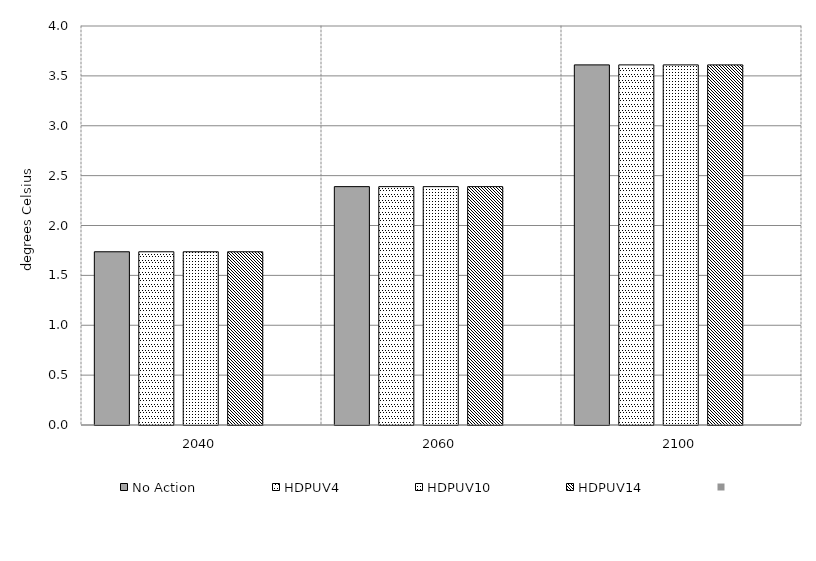
| Category | No Action | HDPUV4 | HDPUV10 | HDPUV14 | Series 4 | Alt 5 | Alt 6 | Alt 7 | Alt 8 | Alt 10 |
|---|---|---|---|---|---|---|---|---|---|---|
| 2040.0 | 1.737 | 1.737 | 1.737 | 1.737 |  |  |  |  |  |  |
| 2060.0 | 2.39 | 2.39 | 2.39 | 2.39 |  |  |  |  |  |  |
| 2100.0 | 3.61 | 3.61 | 3.61 | 3.61 |  |  |  |  |  |  |